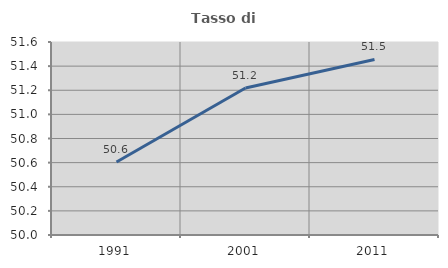
| Category | Tasso di occupazione   |
|---|---|
| 1991.0 | 50.606 |
| 2001.0 | 51.219 |
| 2011.0 | 51.455 |